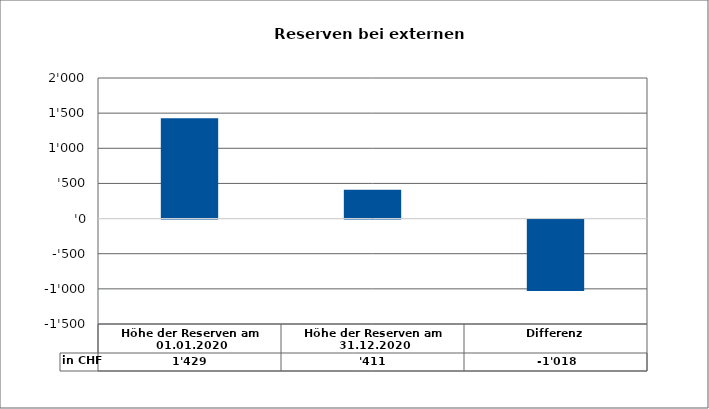
| Category | in CHF |
|---|---|
| Höhe der Reserven am 01.01.2020 | 1429 |
| Höhe der Reserven am 31.12.2020 | 411 |
| Differenz | -1018 |